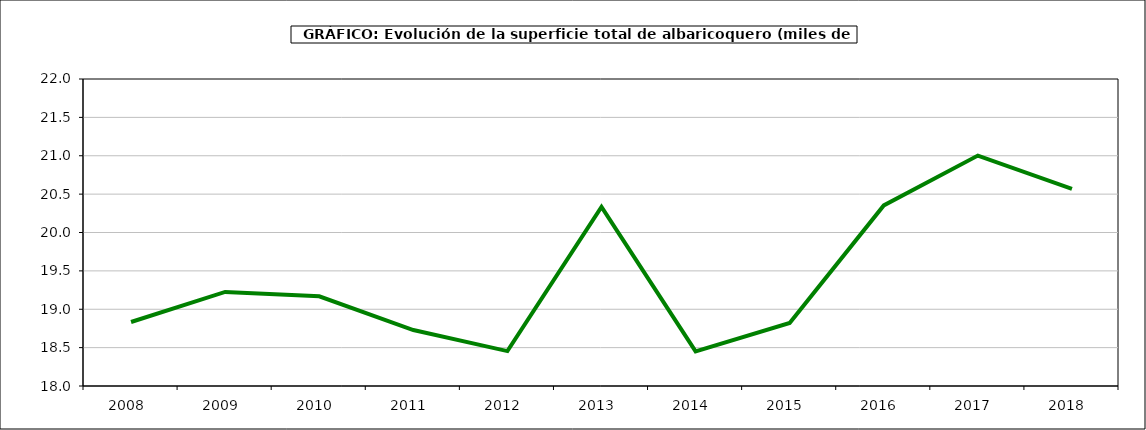
| Category | superficie albaricoquero |
|---|---|
| 2008.0 | 18.834 |
| 2009.0 | 19.226 |
| 2010.0 | 19.169 |
| 2011.0 | 18.729 |
| 2012.0 | 18.455 |
| 2013.0 | 20.334 |
| 2014.0 | 18.451 |
| 2015.0 | 18.822 |
| 2016.0 | 20.353 |
| 2017.0 | 21.002 |
| 2018.0 | 20.567 |